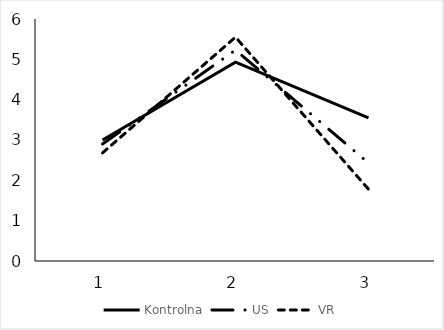
| Category | Kontrolna | US | VR |
|---|---|---|---|
| 0 | 3 | 2.9 | 2.68 |
| 1 | 4.93 | 5.23 | 5.55 |
| 2 | 3.55 | 2.43 | 1.78 |